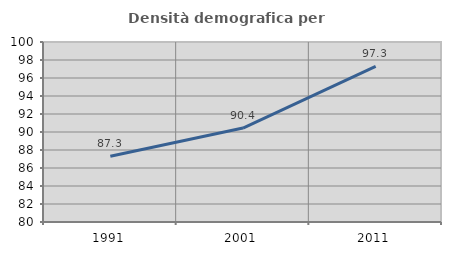
| Category | Densità demografica |
|---|---|
| 1991.0 | 87.312 |
| 2001.0 | 90.439 |
| 2011.0 | 97.282 |